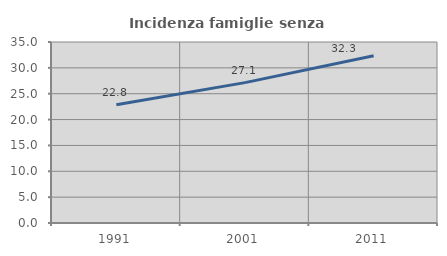
| Category | Incidenza famiglie senza nuclei |
|---|---|
| 1991.0 | 22.849 |
| 2001.0 | 27.143 |
| 2011.0 | 32.327 |